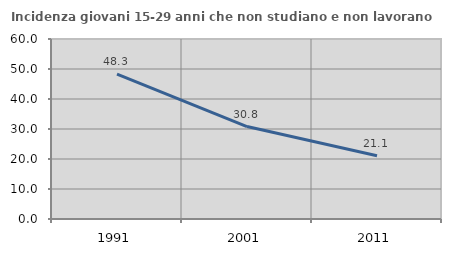
| Category | Incidenza giovani 15-29 anni che non studiano e non lavorano  |
|---|---|
| 1991.0 | 48.289 |
| 2001.0 | 30.814 |
| 2011.0 | 21.111 |